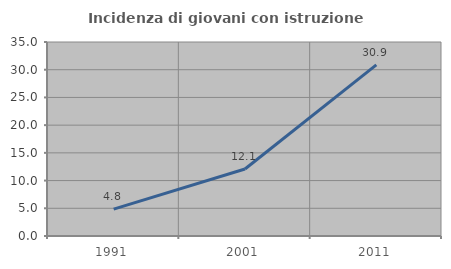
| Category | Incidenza di giovani con istruzione universitaria |
|---|---|
| 1991.0 | 4.839 |
| 2001.0 | 12.088 |
| 2011.0 | 30.882 |